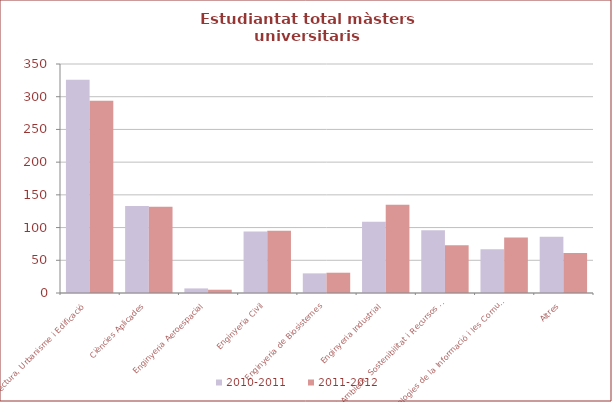
| Category | 2010-2011 | 2011-2012 |
|---|---|---|
| Arquitectura, Urbanisme i Edificació | 326 | 294 |
| Ciències Aplicades | 133 | 132 |
| Enginyeria Aeroespacial | 7 | 5 |
| Enginyeria Civil | 94 | 95 |
| Enginyeria de Biosistemes | 30 | 31 |
| Enginyeria Industrial | 109 | 135 |
| Medi Ambient, Sostenibilitat i Recursos Naturals | 96 | 73 |
| Tecnologies de la Informació i les Comunicacions | 67 | 85 |
| Altres | 86 | 61 |